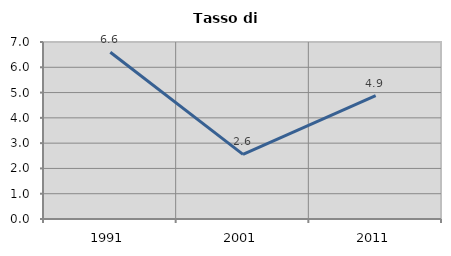
| Category | Tasso di disoccupazione   |
|---|---|
| 1991.0 | 6.597 |
| 2001.0 | 2.554 |
| 2011.0 | 4.88 |